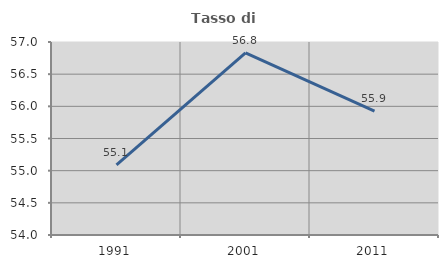
| Category | Tasso di occupazione   |
|---|---|
| 1991.0 | 55.09 |
| 2001.0 | 56.831 |
| 2011.0 | 55.925 |